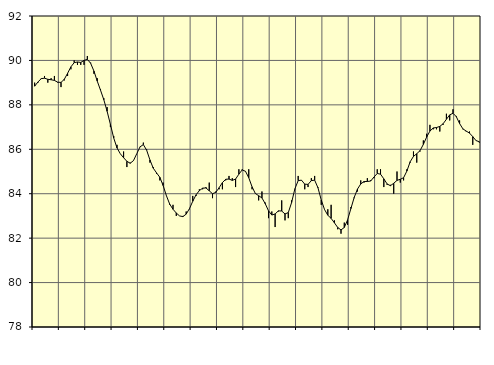
| Category | Piggar | Series 1 |
|---|---|---|
| nan | 89 | 88.84 |
| 87.0 | 89 | 89.03 |
| 87.0 | 89.2 | 89.18 |
| 87.0 | 89.3 | 89.2 |
| nan | 89 | 89.15 |
| 88.0 | 89.2 | 89.13 |
| 88.0 | 89.3 | 89.1 |
| 88.0 | 89 | 89.02 |
| nan | 88.8 | 89.01 |
| 89.0 | 89.1 | 89.15 |
| 89.0 | 89.3 | 89.42 |
| 89.0 | 89.6 | 89.71 |
| nan | 90 | 89.9 |
| 90.0 | 89.8 | 89.93 |
| 90.0 | 89.8 | 89.91 |
| 90.0 | 89.8 | 90 |
| nan | 90.2 | 90.05 |
| 91.0 | 89.9 | 89.87 |
| 91.0 | 89.4 | 89.52 |
| 91.0 | 89.2 | 89.07 |
| nan | 88.7 | 88.66 |
| 92.0 | 88.3 | 88.23 |
| 92.0 | 87.9 | 87.71 |
| 92.0 | 87 | 87.12 |
| nan | 86.6 | 86.51 |
| 93.0 | 86.2 | 86.06 |
| 93.0 | 85.8 | 85.8 |
| 93.0 | 85.9 | 85.62 |
| nan | 85.2 | 85.46 |
| 94.0 | 85.4 | 85.37 |
| 94.0 | 85.5 | 85.49 |
| 94.0 | 85.8 | 85.8 |
| nan | 86.1 | 86.11 |
| 95.0 | 86.3 | 86.21 |
| 95.0 | 86 | 85.96 |
| 95.0 | 85.4 | 85.52 |
| nan | 85.2 | 85.15 |
| 96.0 | 84.9 | 84.94 |
| 96.0 | 84.6 | 84.74 |
| 96.0 | 84.5 | 84.37 |
| nan | 83.9 | 83.91 |
| 97.0 | 83.5 | 83.53 |
| 97.0 | 83.5 | 83.3 |
| 97.0 | 83 | 83.13 |
| nan | 83 | 83 |
| 98.0 | 83 | 82.97 |
| 98.0 | 83.2 | 83.08 |
| 98.0 | 83.3 | 83.33 |
| nan | 83.9 | 83.66 |
| 99.0 | 83.9 | 83.95 |
| 99.0 | 84.2 | 84.14 |
| 99.0 | 84.2 | 84.25 |
| nan | 84.3 | 84.26 |
| 0.0 | 84.5 | 84.13 |
| 0.0 | 83.8 | 84 |
| 0.0 | 84.1 | 84.06 |
| nan | 84.2 | 84.27 |
| 1.0 | 84.2 | 84.5 |
| 1.0 | 84.6 | 84.65 |
| 1.0 | 84.8 | 84.66 |
| nan | 84.7 | 84.6 |
| 2.0 | 84.3 | 84.66 |
| 2.0 | 85.1 | 84.88 |
| 2.0 | 85.1 | 85.07 |
| nan | 85 | 85.01 |
| 3.0 | 85.1 | 84.72 |
| 3.0 | 84.2 | 84.31 |
| 3.0 | 84 | 84.01 |
| nan | 83.7 | 83.91 |
| 4.0 | 84.1 | 83.81 |
| 4.0 | 83.6 | 83.55 |
| 4.0 | 82.9 | 83.23 |
| nan | 83.2 | 83.04 |
| 5.0 | 82.5 | 83.09 |
| 5.0 | 83.2 | 83.23 |
| 5.0 | 83.7 | 83.22 |
| nan | 82.8 | 83.09 |
| 6.0 | 82.9 | 83.15 |
| 6.0 | 83.7 | 83.6 |
| 6.0 | 84.2 | 84.22 |
| nan | 84.8 | 84.59 |
| 7.0 | 84.6 | 84.61 |
| 7.0 | 84.2 | 84.43 |
| 7.0 | 84.3 | 84.42 |
| nan | 84.7 | 84.59 |
| 8.0 | 84.8 | 84.61 |
| 8.0 | 84.3 | 84.27 |
| 8.0 | 83.5 | 83.72 |
| nan | 83.3 | 83.29 |
| 9.0 | 83.3 | 83.03 |
| 9.0 | 83.5 | 82.89 |
| 9.0 | 82.8 | 82.69 |
| nan | 82.4 | 82.48 |
| 10.0 | 82.2 | 82.37 |
| 10.0 | 82.7 | 82.48 |
| 10.0 | 82.6 | 82.82 |
| nan | 83.4 | 83.33 |
| 11.0 | 83.8 | 83.83 |
| 11.0 | 84.1 | 84.21 |
| 11.0 | 84.6 | 84.44 |
| nan | 84.5 | 84.55 |
| 12.0 | 84.7 | 84.55 |
| 12.0 | 84.6 | 84.57 |
| 12.0 | 84.7 | 84.75 |
| nan | 85.1 | 84.91 |
| 13.0 | 85.1 | 84.88 |
| 13.0 | 84.3 | 84.67 |
| 13.0 | 84.4 | 84.44 |
| nan | 84.4 | 84.36 |
| 14.0 | 84 | 84.47 |
| 14.0 | 85 | 84.6 |
| 14.0 | 84.5 | 84.65 |
| nan | 84.6 | 84.72 |
| 15.0 | 85.1 | 85.02 |
| 15.0 | 85.4 | 85.44 |
| 15.0 | 85.9 | 85.68 |
| nan | 85.4 | 85.8 |
| 16.0 | 85.9 | 85.94 |
| 16.0 | 86.4 | 86.22 |
| 16.0 | 86.7 | 86.55 |
| nan | 87.1 | 86.82 |
| 17.0 | 86.9 | 86.96 |
| 17.0 | 86.9 | 86.98 |
| 17.0 | 86.8 | 87.03 |
| nan | 87.1 | 87.15 |
| 18.0 | 87.6 | 87.35 |
| 18.0 | 87.3 | 87.55 |
| 18.0 | 87.8 | 87.62 |
| nan | 87.5 | 87.47 |
| 19.0 | 87.3 | 87.16 |
| 19.0 | 86.9 | 86.92 |
| 19.0 | 86.8 | 86.82 |
| nan | 86.8 | 86.73 |
| 20.0 | 86.2 | 86.57 |
| 20.0 | 86.4 | 86.39 |
| 20.0 | 86.3 | 86.34 |